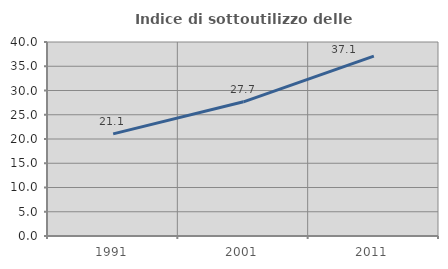
| Category | Indice di sottoutilizzo delle abitazioni  |
|---|---|
| 1991.0 | 21.057 |
| 2001.0 | 27.671 |
| 2011.0 | 37.081 |